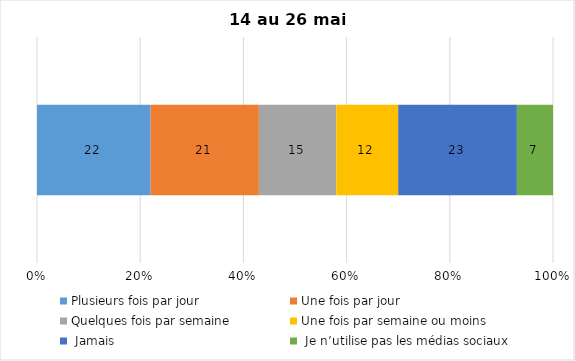
| Category | Plusieurs fois par jour | Une fois par jour | Quelques fois par semaine   | Une fois par semaine ou moins   |  Jamais   |  Je n’utilise pas les médias sociaux |
|---|---|---|---|---|---|---|
| 0 | 22 | 21 | 15 | 12 | 23 | 7 |